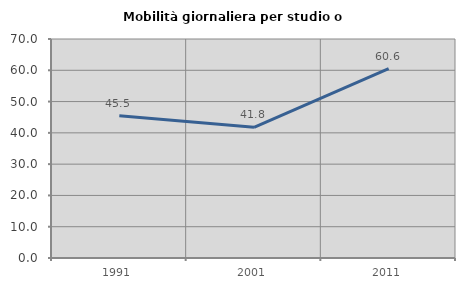
| Category | Mobilità giornaliera per studio o lavoro |
|---|---|
| 1991.0 | 45.455 |
| 2001.0 | 41.791 |
| 2011.0 | 60.563 |